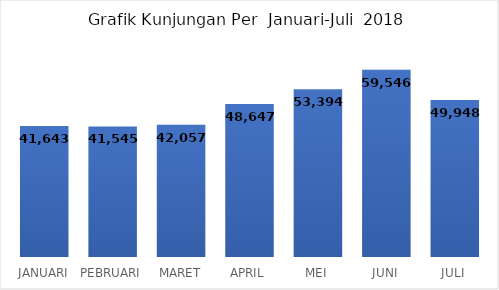
| Category |  41,643  |
|---|---|
| JANUARI | 41643 |
| PEBRUARI | 41545 |
| MARET | 42057 |
| APRIL | 48647 |
| MEI | 53394 |
| JUNI | 59546 |
| JULI | 49948 |